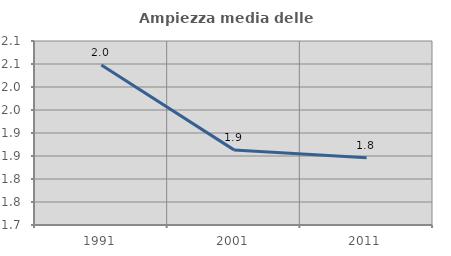
| Category | Ampiezza media delle famiglie |
|---|---|
| 1991.0 | 2.048 |
| 2001.0 | 1.863 |
| 2011.0 | 1.846 |